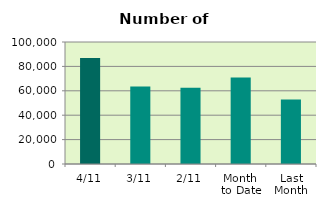
| Category | Series 0 |
|---|---|
| 4/11 | 86828 |
| 3/11 | 63562 |
| 2/11 | 62498 |
| Month 
to Date | 70962.667 |
| Last
Month | 52845 |